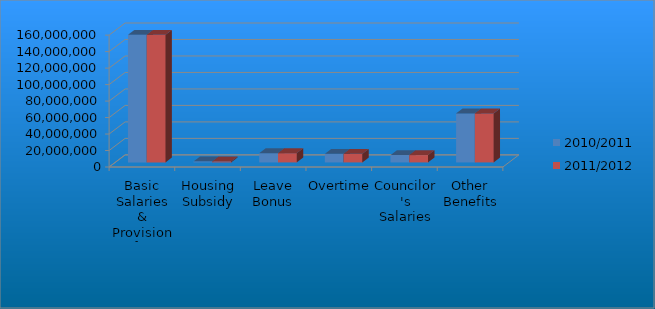
| Category | 2010/2011 | 2011/2012 |
|---|---|---|
| Basic Salaries & Provision for Vacancies | 154829186 | 154829186 |
| Housing Subsidy | 1282400 | 1282400 |
| Leave Bonus | 11250824 | 11250824 |
| Overtime | 10477541 | 10477541 |
| Councilor's Salaries | 8866449 | 8866449 |
| Other Benefits | 59508777 | 59508777 |